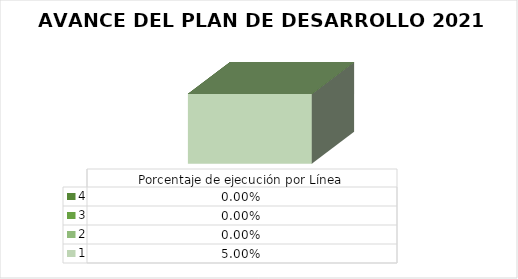
| Category | 1 | 2 | 3 | 4 |
|---|---|---|---|---|
| 0 | 0.05 | 0 | 0 | 0 |